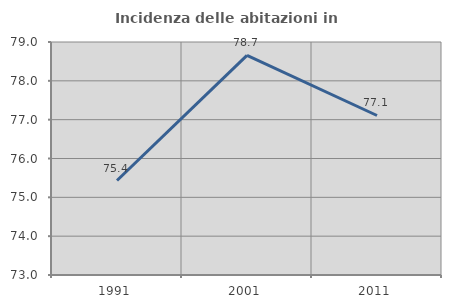
| Category | Incidenza delle abitazioni in proprietà  |
|---|---|
| 1991.0 | 75.433 |
| 2001.0 | 78.655 |
| 2011.0 | 77.107 |